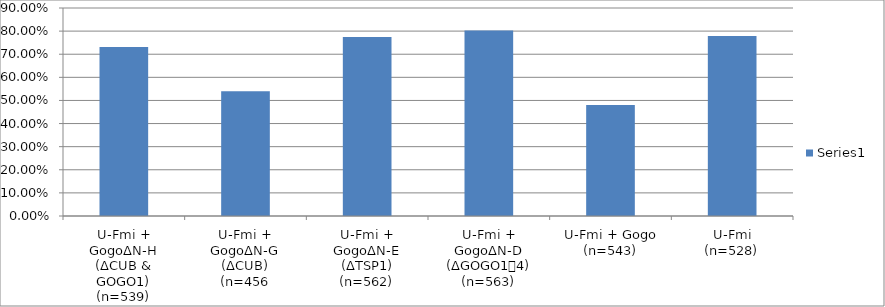
| Category | Series 0 |
|---|---|
| U-Fmi + GogoΔN-H
(ΔCUB & GOGO1)
(n=539) | 0.731 |
| U-Fmi + GogoΔN-G
(ΔCUB)
(n=456 | 0.539 |
| U-Fmi + GogoΔN-E
(ΔTSP1)
(n=562) | 0.774 |
| U-Fmi + GogoΔN-D
(ΔGOGO1〜4)
(n=563) | 0.803 |
| U-Fmi + Gogo
(n=543) | 0.481 |
| U-Fmi
(n=528) | 0.778 |